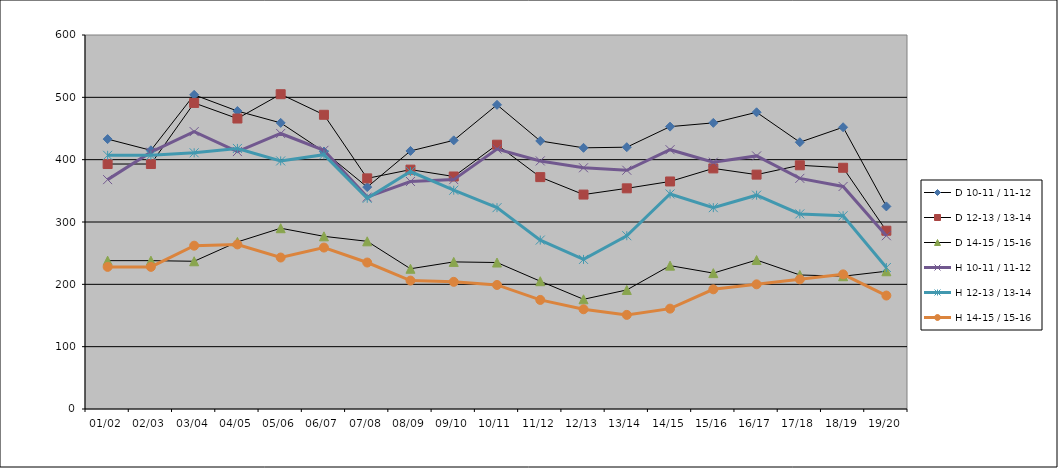
| Category | D 10-11 / 11-12 | D 12-13 / 13-14 | D 14-15 / 15-16 | H 10-11 / 11-12 | H 12-13 / 13-14 | H 14-15 / 15-16 |
|---|---|---|---|---|---|---|
| 01/02 | 433 | 393 | 238 | 368 | 407 | 228 |
| 02/03 | 415 | 393 | 238 | 412 | 407 | 228 |
| 03/04 | 504 | 491 | 237 | 445 | 411 | 262 |
| 04/05 | 478 | 466 | 268 | 413 | 418 | 264 |
| 05/06 | 459 | 505 | 290 | 442 | 398 | 243 |
| 06/07 | 413 | 472 | 277 | 415 | 408 | 259 |
| 07/08 | 356 | 370 | 269 | 340 | 338 | 235 |
| 08/09 | 414 | 384 | 225 | 365 | 381 | 206 |
| 09/10 | 431 | 373 | 236 | 368 | 351 | 204 |
| 10/11 | 488 | 424 | 235 | 417 | 323 | 199 |
| 11/12 | 430 | 372 | 205 | 398 | 271 | 175 |
| 12/13 | 419 | 344 | 176 | 387 | 240 | 160 |
| 13/14 | 420 | 354 | 191 | 383 | 278 | 151 |
| 14/15 | 453 | 365 | 230 | 416 | 345 | 161 |
| 15/16 | 459 | 386 | 218 | 396 | 323 | 192 |
| 16/17 | 476 | 376 | 239 | 406 | 343 | 200 |
| 17/18 | 428 | 391 | 215 | 370 | 313 | 208 |
| 18/19 | 452 | 387 | 213 | 357 | 310 | 216 |
| 19/20 | 325 | 286 | 221 | 278 | 227 | 182 |